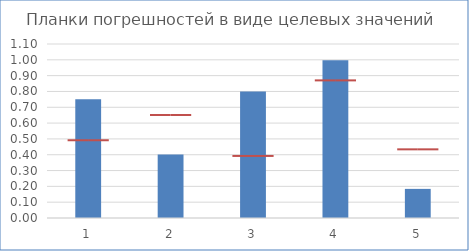
| Category | Actual |
|---|---|
| 0 | 0.75 |
| 1 | 0.401 |
| 2 | 0.8 |
| 3 | 0.997 |
| 4 | 0.184 |